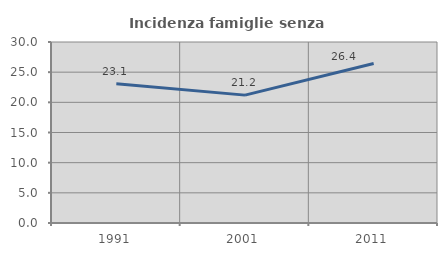
| Category | Incidenza famiglie senza nuclei |
|---|---|
| 1991.0 | 23.085 |
| 2001.0 | 21.196 |
| 2011.0 | 26.436 |